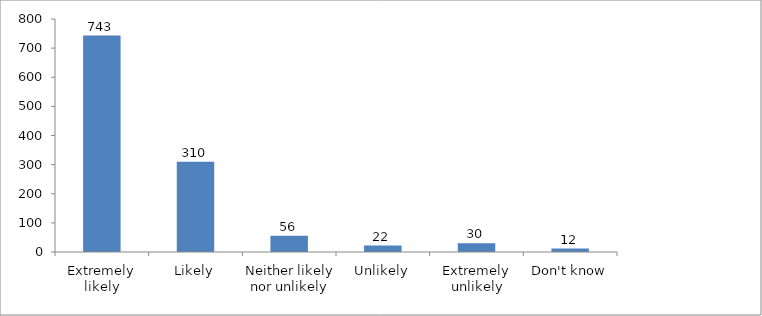
| Category | Series 0 |
|---|---|
| Extremely likely | 743 |
| Likely | 310 |
| Neither likely nor unlikely | 56 |
| Unlikely | 22 |
| Extremely unlikely | 30 |
| Don't know | 12 |